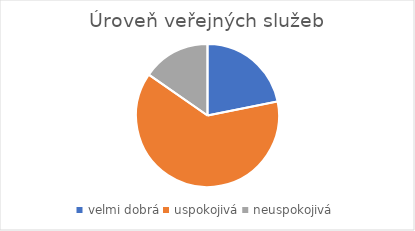
| Category | Úroveň veřejných služeb |
|---|---|
| velmi dobrá | 57 |
| uspokojivá | 164 |
| neuspokojivá | 40 |